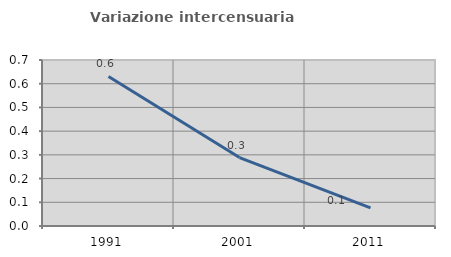
| Category | Variazione intercensuaria annua |
|---|---|
| 1991.0 | 0.631 |
| 2001.0 | 0.289 |
| 2011.0 | 0.077 |